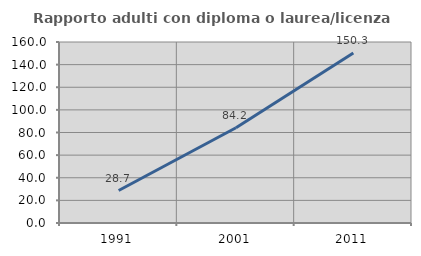
| Category | Rapporto adulti con diploma o laurea/licenza media  |
|---|---|
| 1991.0 | 28.718 |
| 2001.0 | 84.236 |
| 2011.0 | 150.273 |